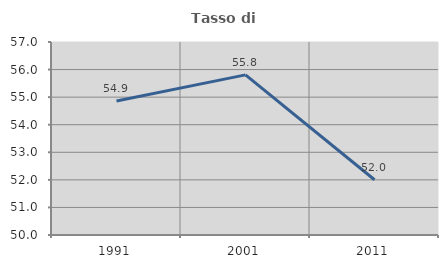
| Category | Tasso di occupazione   |
|---|---|
| 1991.0 | 54.863 |
| 2001.0 | 55.808 |
| 2011.0 | 52.003 |